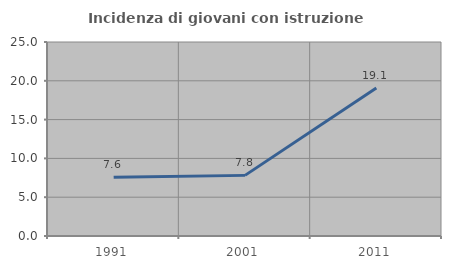
| Category | Incidenza di giovani con istruzione universitaria |
|---|---|
| 1991.0 | 7.558 |
| 2001.0 | 7.812 |
| 2011.0 | 19.075 |